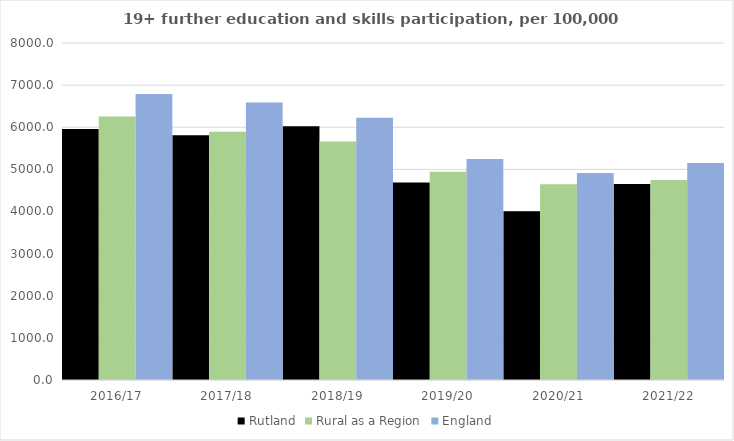
| Category | Rutland | Rural as a Region | England |
|---|---|---|---|
| 2016/17 | 5960 | 6253.401 | 6788 |
| 2017/18 | 5811 | 5892.029 | 6588 |
| 2018/19 | 6025 | 5661.873 | 6227 |
| 2019/20 | 4689 | 4943.801 | 5244 |
| 2020/21 | 4006 | 4646.727 | 4913 |
| 2021/22 | 4652 | 4747.049 | 5151 |